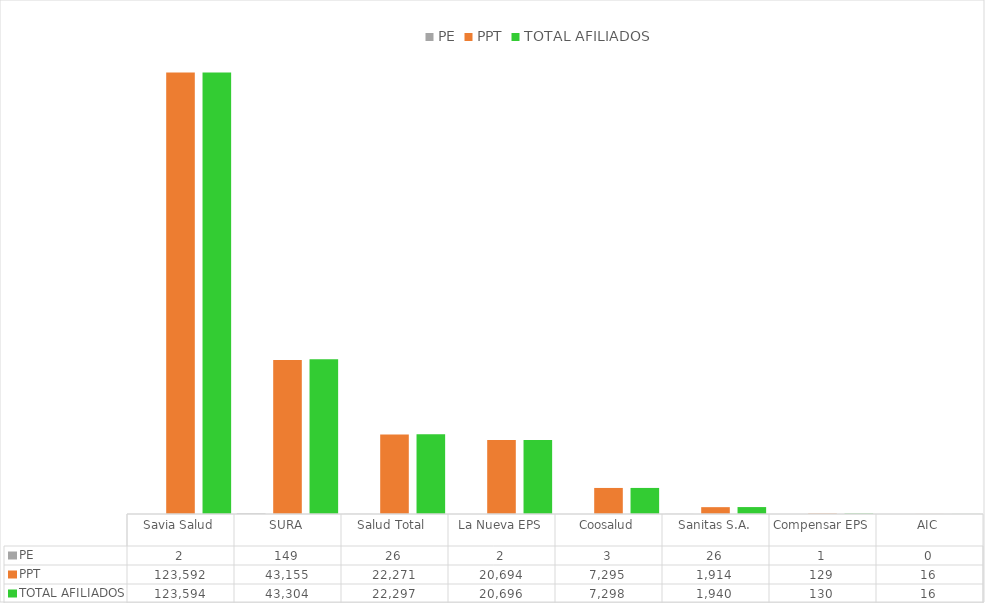
| Category | PE | PPT | TOTAL AFILIADOS |
|---|---|---|---|
| Savia Salud | 2 | 123592 | 123594 |
| SURA | 149 | 43155 | 43304 |
| Salud Total  | 26 | 22271 | 22297 |
| La Nueva EPS | 2 | 20694 | 20696 |
| Coosalud | 3 | 7295 | 7298 |
| Sanitas S.A. | 26 | 1914 | 1940 |
| Compensar EPS | 1 | 129 | 130 |
| AIC | 0 | 16 | 16 |